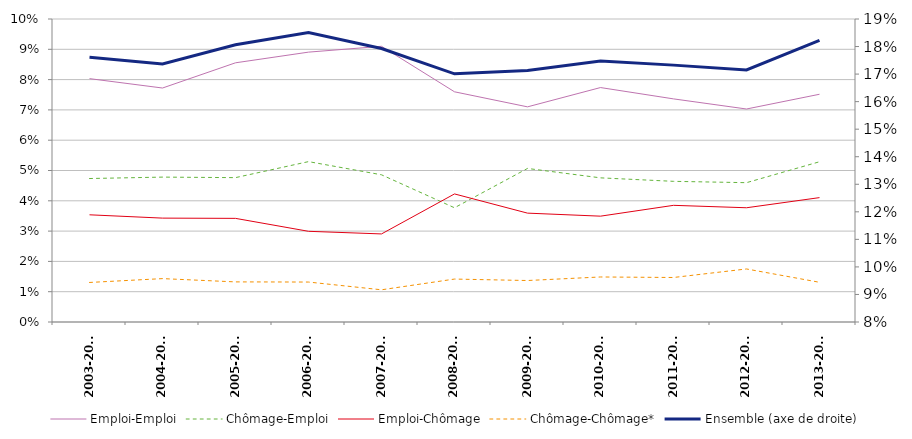
| Category | Emploi-Emploi | Chômage-Emploi | Emploi-Chômage | Chômage-Chômage* |
|---|---|---|---|---|
| 2003-2004 | 0.08 | 0.047 | 0.035 | 0.013 |
| 2004-2005 | 0.077 | 0.048 | 0.034 | 0.014 |
| 2005-2006 | 0.086 | 0.048 | 0.034 | 0.013 |
| 2006-2007 | 0.089 | 0.053 | 0.03 | 0.013 |
| 2007-2008 | 0.091 | 0.049 | 0.029 | 0.011 |
| 2008-2009 | 0.076 | 0.038 | 0.042 | 0.014 |
| 2009-2010 | 0.071 | 0.051 | 0.036 | 0.014 |
| 2010-2011 | 0.077 | 0.048 | 0.035 | 0.015 |
| 2011-2012 | 0.074 | 0.046 | 0.039 | 0.015 |
| 2012-2013 | 0.07 | 0.046 | 0.038 | 0.018 |
| 2013-2014 | 0.075 | 0.053 | 0.041 | 0.013 |